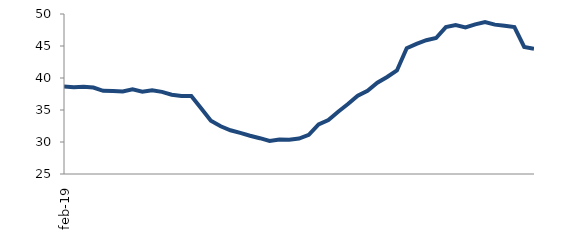
| Category | Series 0 |
|---|---|
| 2019-02-01 | 38.654 |
| 2019-03-01 | 38.565 |
| 2019-04-01 | 38.617 |
| 2019-05-01 | 38.507 |
| 2019-06-01 | 37.997 |
| 2019-07-01 | 37.971 |
| 2019-08-01 | 37.903 |
| 2019-09-01 | 38.24 |
| 2019-10-01 | 37.871 |
| 2019-11-01 | 38.1 |
| 2019-12-01 | 37.835 |
| 2020-01-01 | 37.392 |
| 2020-02-01 | 37.189 |
| 2020-03-01 | 37.204 |
| 2020-04-01 | 35.29 |
| 2020-05-01 | 33.333 |
| 2020-06-01 | 32.452 |
| 2020-07-01 | 31.838 |
| 2020-08-01 | 31.419 |
| 2020-09-01 | 30.981 |
| 2020-10-01 | 30.594 |
| 2020-11-01 | 30.171 |
| 2020-12-01 | 30.403 |
| 2021-01-01 | 30.34 |
| 2021-02-01 | 30.54 |
| 2021-03-01 | 31.11 |
| 2021-04-01 | 32.754 |
| 2021-05-01 | 33.426 |
| 2021-06-01 | 34.734 |
| 2021-07-01 | 35.931 |
| 2021-08-01 | 37.243 |
| 2021-09-01 | 38.013 |
| 2021-10-01 | 39.272 |
| 2021-11-01 | 40.164 |
| 2021-12-01 | 41.181 |
| 2022-01-01 | 44.658 |
| 2022-02-01 | 45.342 |
| 2022-03-01 | 45.908 |
| 2022-04-01 | 46.255 |
| 2022-05-01 | 47.946 |
| 2022-06-01 | 48.273 |
| 2022-07-01 | 47.899 |
| 2022-08-01 | 48.372 |
| 2022-09-01 | 48.755 |
| 2022-10-01 | 48.341 |
| 2022-11-01 | 48.148 |
| 2022-12-01 | 47.955 |
| 2023-01-01 | 44.844 |
| 2023-02-01 | 44.552 |